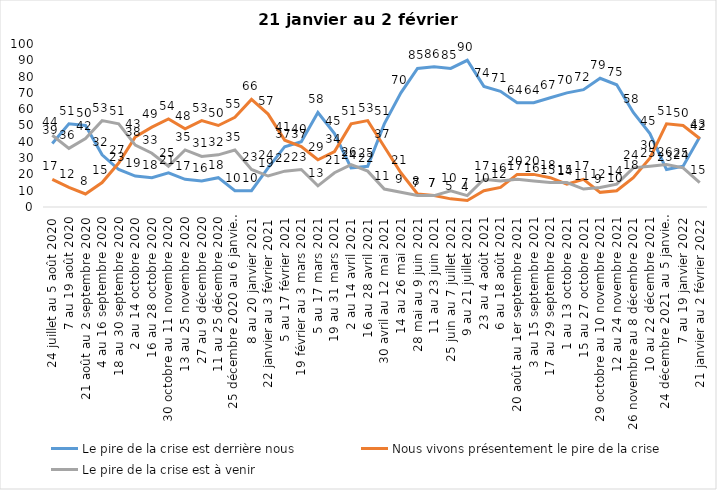
| Category | Le pire de la crise est derrière nous | Nous vivons présentement le pire de la crise | Le pire de la crise est à venir |
|---|---|---|---|
| 24 juillet au 5 août 2020 | 39 | 17 | 44 |
| 7 au 19 août 2020 | 51 | 12 | 36 |
| 21 août au 2 septembre 2020 | 50 | 8 | 42 |
| 4 au 16 septembre 2020 | 32 | 15 | 53 |
| 18 au 30 septembre 2020 | 23 | 27 | 51 |
| 2 au 14 octobre 2020 | 19 | 43 | 38 |
| 16 au 28 octobre 2020 | 18 | 49 | 33 |
| 30 octobre au 11 novembre 2020 | 21 | 54 | 25 |
| 13 au 25 novembre 2020 | 17 | 48 | 35 |
| 27 au 9 décembre 2020 | 16 | 53 | 31 |
| 11 au 25 décembre 2020 | 18 | 50 | 32 |
| 25 décembre 2020 au 6 janvier 2021 | 10 | 55 | 35 |
| 8 au 20 janvier 2021 | 10 | 66 | 23 |
| 22 janvier au 3 février 2021 | 24 | 57 | 19 |
| 5 au 17 février 2021 | 37 | 41 | 22 |
| 19 février au 3 mars 2021 | 40 | 37 | 23 |
| 5 au 17 mars 2021 | 58 | 29 | 13 |
| 19 au 31 mars 2021 | 45 | 34 | 21 |
| 2 au 14 avril 2021 | 24 | 51 | 26 |
| 16 au 28 avril 2021 | 25 | 53 | 22 |
| 30 avril au 12 mai 2021 | 51 | 37 | 11 |
| 14 au 26 mai 2021 | 70 | 21 | 9 |
| 28 mai au 9 juin 2021 | 85 | 8 | 7 |
| 11 au 23 juin 2021 | 86 | 7 | 7 |
| 25 juin au 7 juillet 2021 | 85 | 5 | 10 |
| 9 au 21 juillet 2021 | 90 | 4 | 7 |
| 23 au 4 août 2021 | 74 | 10 | 17 |
| 6 au 18 août 2021 | 71 | 12 | 16 |
| 20 août au 1er septembre 2021 | 64 | 20 | 17 |
| 3 au 15 septembre 2021 | 64 | 20 | 16 |
| 17 au 29 septembre 2021 | 67 | 18 | 15 |
| 1 au 13 octobre 2021 | 70 | 14 | 15 |
| 15 au 27 octobre 2021 | 72 | 17 | 11 |
| 29 octobre au 10 novembre 2021 | 79 | 9 | 12 |
| 12 au 24 novembre 2021 | 75 | 10 | 14 |
| 26 novembre au 8 décembre 2021 | 58 | 18 | 24 |
| 10 au 22 décembre 2021 | 45 | 30 | 25 |
| 24 décembre 2021 au 5 janvier 2022 2022 | 23 | 51 | 26 |
| 7 au 19 janvier 2022 | 25 | 50 | 24 |
| 21 janvier au 2 février 2022 | 43 | 42 | 15 |